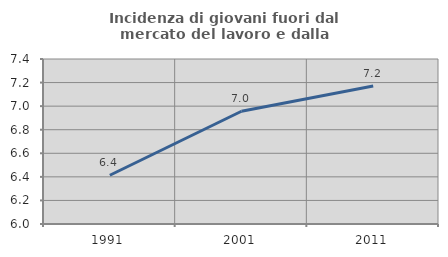
| Category | Incidenza di giovani fuori dal mercato del lavoro e dalla formazione  |
|---|---|
| 1991.0 | 6.414 |
| 2001.0 | 6.957 |
| 2011.0 | 7.171 |